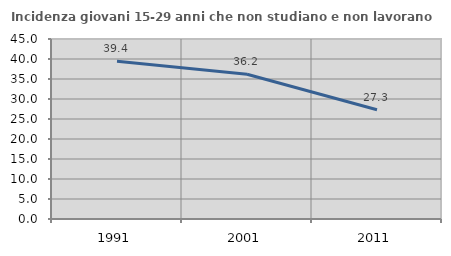
| Category | Incidenza giovani 15-29 anni che non studiano e non lavorano  |
|---|---|
| 1991.0 | 39.41 |
| 2001.0 | 36.179 |
| 2011.0 | 27.296 |